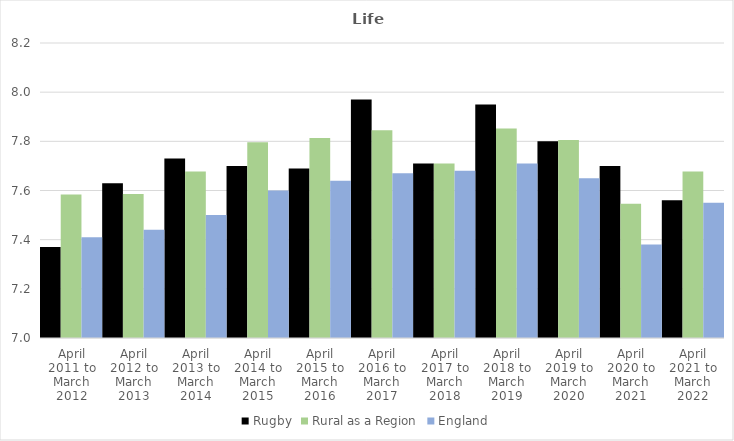
| Category | Rugby | Rural as a Region | England |
|---|---|---|---|
| April 2011 to March 2012 | 7.37 | 7.584 | 7.41 |
| April 2012 to March 2013 | 7.63 | 7.586 | 7.44 |
| April 2013 to March 2014 | 7.73 | 7.677 | 7.5 |
| April 2014 to March 2015 | 7.7 | 7.797 | 7.6 |
| April 2015 to March 2016 | 7.69 | 7.813 | 7.64 |
| April 2016 to March 2017 | 7.97 | 7.845 | 7.67 |
| April 2017 to March 2018 | 7.71 | 7.71 | 7.68 |
| April 2018 to March 2019 | 7.95 | 7.852 | 7.71 |
| April 2019 to March 2020 | 7.8 | 7.806 | 7.65 |
| April 2020 to March 2021 | 7.7 | 7.546 | 7.38 |
| April 2021 to March 2022 | 7.56 | 7.677 | 7.55 |